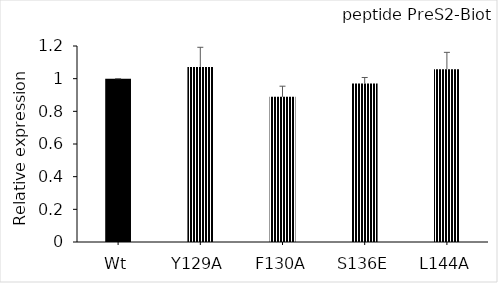
| Category | Series 0 |
|---|---|
| Wt | 1 |
| Y129A | 1.072 |
| F130A | 0.889 |
| S136E | 0.97 |
| L144A | 1.058 |